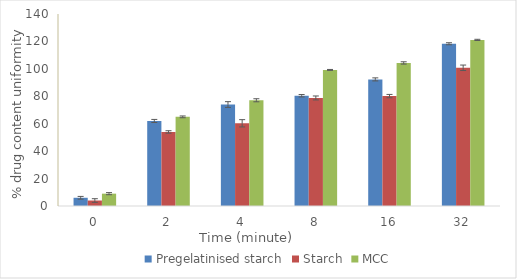
| Category | Pregelatinised starch | Starch | MCC |
|---|---|---|---|
| 0.0 | 6 | 4 | 9 |
| 2.0 | 62 | 54 | 65 |
| 4.0 | 74 | 60.3 | 77.1 |
| 8.0 | 80.4 | 78.78 | 99.22 |
| 16.0 | 92.32 | 80.13 | 104.32 |
| 32.0 | 118.3 | 100.78 | 121.11 |